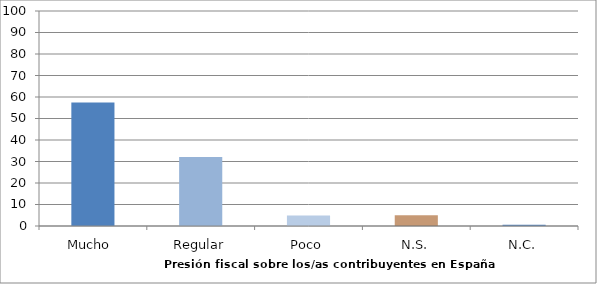
| Category | Series 0 |
|---|---|
| Mucho  | 57.4 |
| Regular | 32.1 |
| Poco | 4.9 |
| N.S. | 5 |
| N.C. | 0.6 |